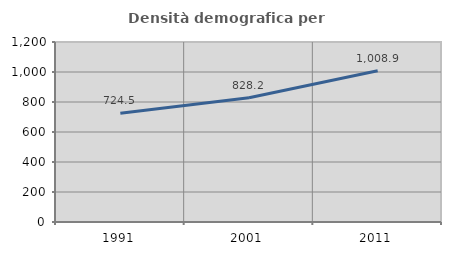
| Category | Densità demografica |
|---|---|
| 1991.0 | 724.513 |
| 2001.0 | 828.177 |
| 2011.0 | 1008.941 |